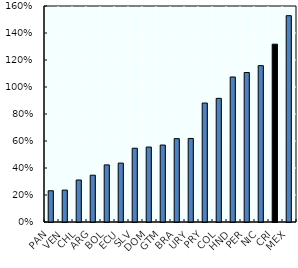
| Category | Costos de formalización teóricos para trabajadores en el primer decil de ingresos |
|---|---|
| PAN | 0.232 |
| VEN | 0.236 |
| CHL | 0.311 |
| ARG | 0.347 |
| BOL | 0.423 |
| ECU | 0.436 |
| SLV | 0.546 |
| DOM | 0.555 |
| GTM | 0.57 |
| BRA | 0.617 |
| URY | 0.619 |
| PRY | 0.881 |
| COL | 0.916 |
| HND | 1.074 |
| PER | 1.107 |
| NIC | 1.158 |
| CRI | 1.317 |
| MEX | 1.528 |